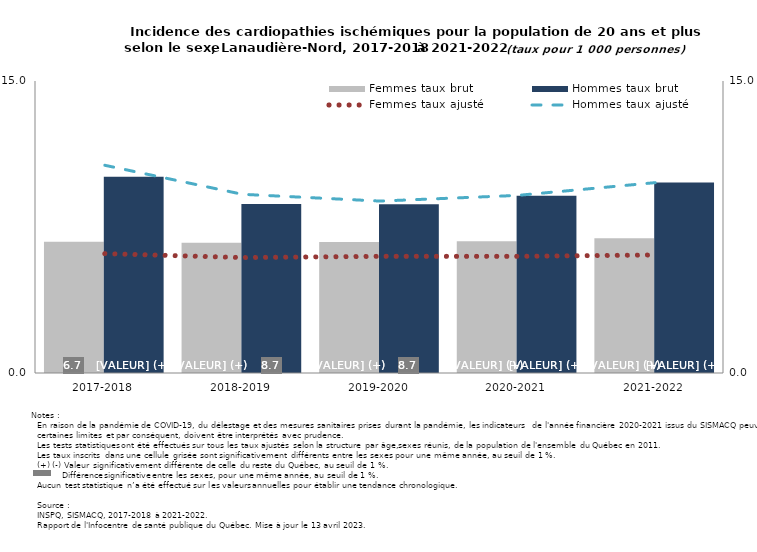
| Category | Femmes taux brut | Hommes taux brut |
|---|---|---|
| 2017-2018 | 6.745 | 10.087 |
| 2018-2019 | 6.686 | 8.683 |
| 2019-2020 | 6.725 | 8.672 |
| 2020-2021 | 6.767 | 9.109 |
| 2021-2022 | 6.924 | 9.784 |